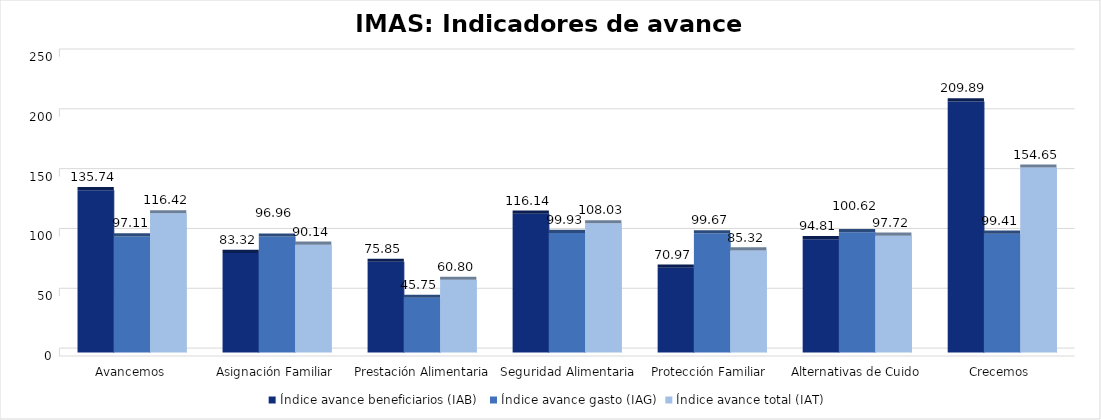
| Category | Índice avance beneficiarios (IAB)  | Índice avance gasto (IAG) | Índice avance total (IAT)  |
|---|---|---|---|
| Avancemos | 135.737 | 97.113 | 116.425 |
| Asignación Familiar | 83.316 | 96.964 | 90.14 |
| Prestación Alimentaria | 75.845 | 45.747 | 60.796 |
| Seguridad Alimentaria | 116.14 | 99.927 | 108.034 |
| Protección Familiar  | 70.968 | 99.667 | 85.317 |
| Alternativas de Cuido | 94.809 | 100.623 | 97.716 |
| Crecemos  | 209.885 | 99.407 | 154.646 |